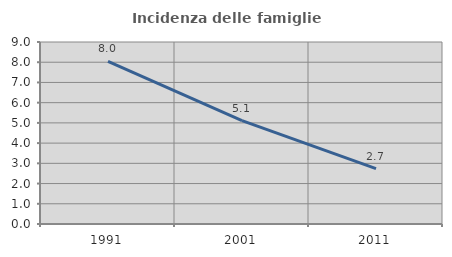
| Category | Incidenza delle famiglie numerose |
|---|---|
| 1991.0 | 8.037 |
| 2001.0 | 5.111 |
| 2011.0 | 2.739 |